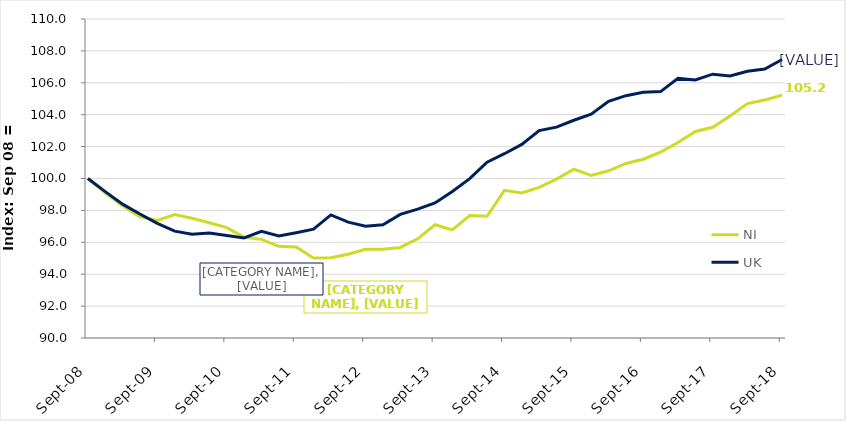
| Category | NI | UK |
|---|---|---|
| 2008-09-01 | 100 | 100 |
| 2008-12-01 | 99.094 | 99.179 |
| 2009-03-01 | 98.294 | 98.392 |
| 2009-06-01 | 97.603 | 97.772 |
| 2009-09-01 | 97.368 | 97.183 |
| 2009-12-01 | 97.74 | 96.7 |
| 2010-03-01 | 97.511 | 96.51 |
| 2010-06-01 | 97.229 | 96.577 |
| 2010-09-01 | 96.917 | 96.425 |
| 2010-12-01 | 96.321 | 96.273 |
| 2011-03-01 | 96.184 | 96.689 |
| 2011-06-01 | 95.749 | 96.4 |
| 2011-09-01 | 95.701 | 96.601 |
| 2011-12-01 | 95.02 | 96.82 |
| 2012-03-01 | 95.031 | 97.715 |
| 2012-06-01 | 95.251 | 97.264 |
| 2012-09-01 | 95.566 | 97.01 |
| 2012-12-01 | 95.562 | 97.095 |
| 2013-03-01 | 95.679 | 97.747 |
| 2013-06-01 | 96.217 | 98.079 |
| 2013-09-01 | 97.102 | 98.466 |
| 2013-12-01 | 96.776 | 99.182 |
| 2014-03-01 | 97.676 | 99.993 |
| 2014-06-01 | 97.633 | 101.022 |
| 2014-09-01 | 99.259 | 101.555 |
| 2014-12-01 | 99.091 | 102.137 |
| 2015-03-01 | 99.446 | 103.004 |
| 2015-06-01 | 99.964 | 103.222 |
| 2015-09-01 | 100.589 | 103.653 |
| 2015-12-01 | 100.19 | 104.026 |
| 2016-03-01 | 100.483 | 104.834 |
| 2016-06-01 | 100.943 | 105.193 |
| 2016-09-01 | 101.208 | 105.412 |
| 2016-12-01 | 101.657 | 105.447 |
| 2017-03-01 | 102.255 | 106.276 |
| 2017-06-01 | 102.948 | 106.173 |
| 2017-09-01 | 103.211 | 106.54 |
| 2017-12-01 | 103.917 | 106.431 |
| 2018-03-01 | 104.696 | 106.723 |
| 2018-06-01 | 104.923 | 106.864 |
| 2018-09-01 | 105.23 | 107.46 |